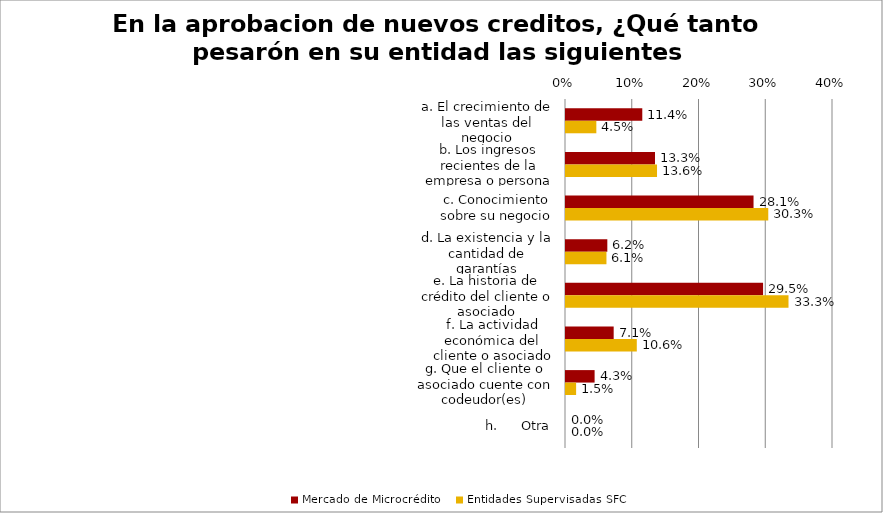
| Category | Mercado de Microcrédito | Entidades Supervisadas SFC |
|---|---|---|
| a. El crecimiento de las ventas del negocio | 0.114 | 0.045 |
| b. Los ingresos recientes de la empresa o persona natural | 0.133 | 0.136 |
| c. Conocimiento sobre su negocio | 0.281 | 0.303 |
| d. La existencia y la cantidad de garantías | 0.062 | 0.061 |
| e. La historia de crédito del cliente o asociado | 0.295 | 0.333 |
| f. La actividad económica del cliente o asociado | 0.071 | 0.106 |
| g. Que el cliente o asociado cuente con codeudor(es) | 0.043 | 0.015 |
| h.      Otra | 0 | 0 |